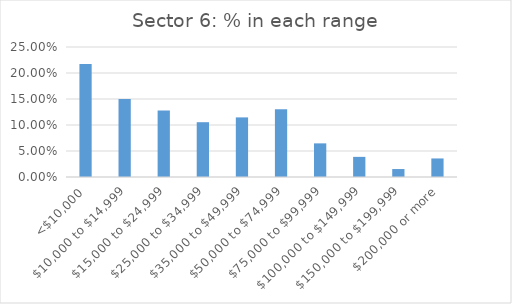
| Category | Series 0 |
|---|---|
| <$10,000 | 0.217 |
| $10,000 to $14,999 | 0.15 |
| $15,000 to $24,999 | 0.128 |
| $25,000 to $34,999 | 0.105 |
| $35,000 to $49,999 | 0.115 |
| $50,000 to $74,999 | 0.13 |
| $75,000 to $99,999 | 0.065 |
| $100,000 to $149,999 | 0.039 |
| $150,000 to $199,999 | 0.015 |
| $200,000 or more | 0.036 |